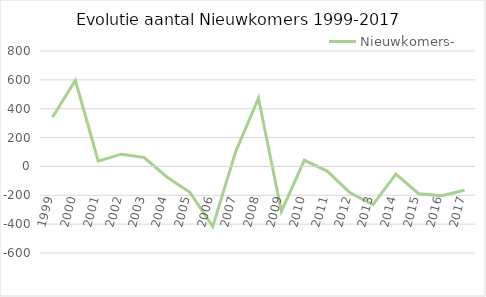
| Category | Nieuwkomers- |
|---|---|
| 1999.0 | 341 |
| 2000.0 | 596 |
| 2001.0 | 37 |
| 2002.0 | 85 |
| 2003.0 | 62 |
| 2004.0 | -73 |
| 2005.0 | -179 |
| 2006.0 | -417 |
| 2007.0 | 101 |
| 2008.0 | 473 |
| 2009.0 | -312 |
| 2010.0 | 42 |
| 2011.0 | -32 |
| 2012.0 | -183 |
| 2013.0 | -265 |
| 2014.0 | -53 |
| 2015.0 | -189 |
| 2016.0 | -203 |
| 2017.0 | -165 |